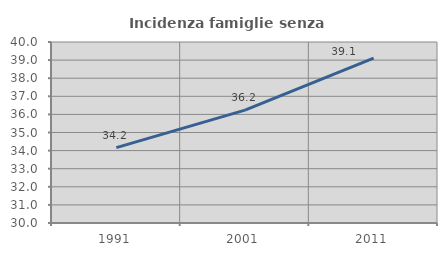
| Category | Incidenza famiglie senza nuclei |
|---|---|
| 1991.0 | 34.165 |
| 2001.0 | 36.236 |
| 2011.0 | 39.11 |